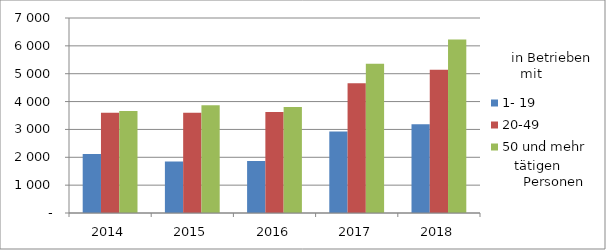
| Category | 1- 19 | 20-49 | 50 und mehr |
|---|---|---|---|
| 2014.0 | 2117 | 3601 | 3658 |
| 2015.0 | 1848 | 3603 | 3869 |
| 2016.0 | 1863 | 3623 | 3801 |
| 2017.0 | 2930 | 4661 | 5360 |
| 2018.0 | 3184 | 5139 | 6227 |